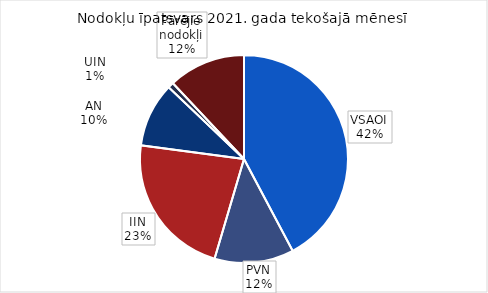
| Category | īpatsvars 2021 |
|---|---|
| VSAOI | 0.43 |
| PVN | 0.126 |
| IIN | 0.229 |
| AN | 0.102 |
| UIN | -0.009 |
| Pārējie nodokļi | 0.122 |